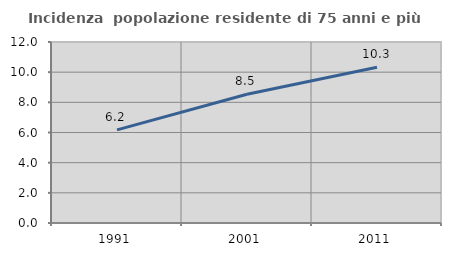
| Category | Incidenza  popolazione residente di 75 anni e più |
|---|---|
| 1991.0 | 6.175 |
| 2001.0 | 8.536 |
| 2011.0 | 10.328 |